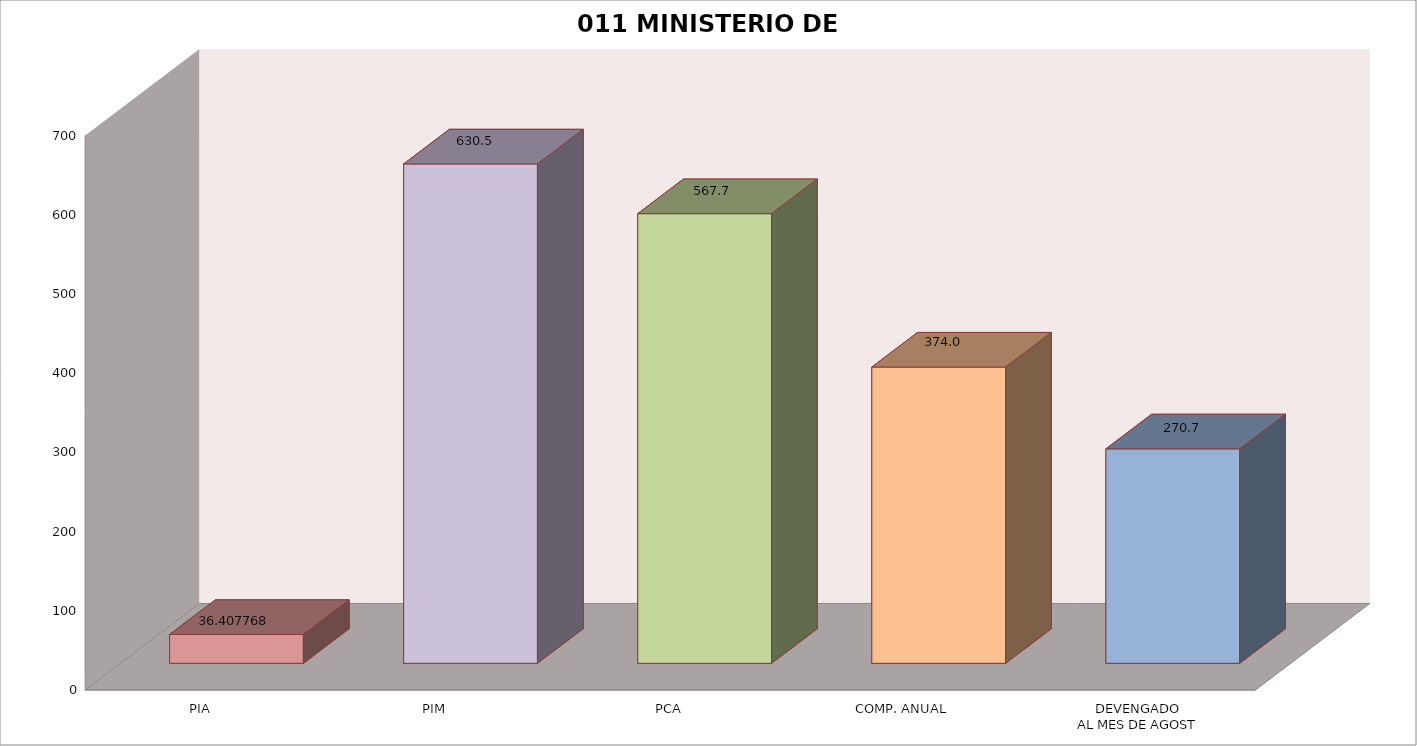
| Category | 011 MINISTERIO DE SALUD |
|---|---|
| PIA | 36.408 |
| PIM | 630.471 |
| PCA | 567.653 |
| COMP. ANUAL | 374.019 |
| DEVENGADO
AL MES DE AGOST | 270.731 |